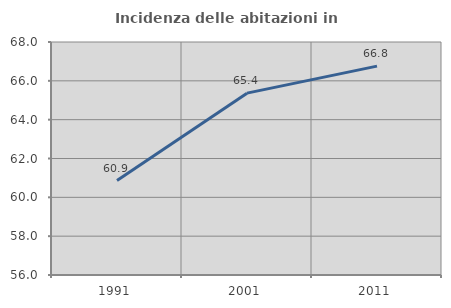
| Category | Incidenza delle abitazioni in proprietà  |
|---|---|
| 1991.0 | 60.864 |
| 2001.0 | 65.366 |
| 2011.0 | 66.757 |